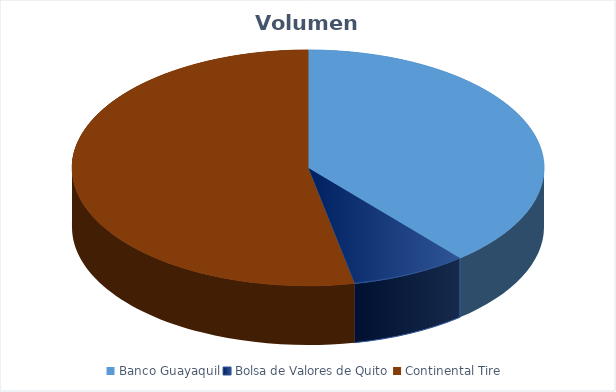
| Category | VOLUMEN ($USD) |
|---|---|
| Banco Guayaquil | 76800 |
| Bolsa de Valores de Quito | 15750 |
| Continental Tire | 105000 |